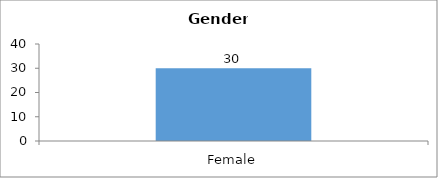
| Category | Gender |
|---|---|
| Female | 30 |